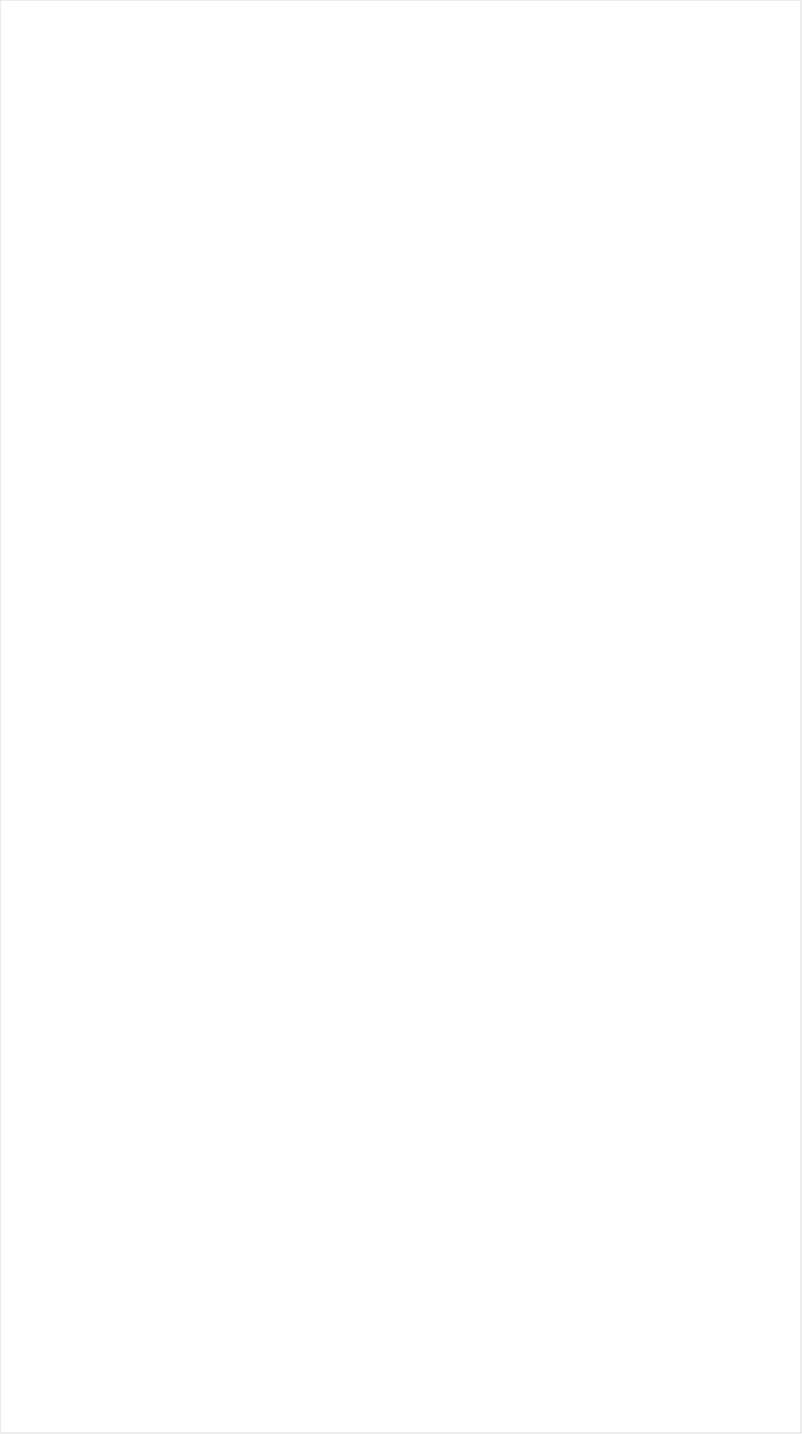
| Category | Total |
|---|---|
| Galavision | -0.933 |
| UniMas | -0.864 |
| Telemundo | -0.86 |
| TUDN | -0.842 |
| NBC Universo | -0.769 |
| Univision | -0.701 |
| VH1 | -0.674 |
| BET | -0.674 |
| BET Her | -0.644 |
| Cartoon Network | -0.642 |
| TV ONE | -0.63 |
| MTV2 | -0.614 |
| Nick Toons | -0.538 |
| Disney XD | -0.538 |
| Teen Nick | -0.532 |
| Logo | -0.501 |
| Adult Swim | -0.496 |
| Nick | -0.494 |
| Lifetime Movies | -0.491 |
| Disney Channel | -0.478 |
| Nick Jr. | -0.45 |
| Universal Kids | -0.42 |
| Oprah Winfrey Network | -0.417 |
| Discovery Life Channel | -0.394 |
| WE TV | -0.38 |
| Travel | -0.365 |
| Disney Junior US | -0.361 |
| TLC | -0.346 |
| Investigation Discovery | -0.321 |
| Lifetime | -0.306 |
| USA Network | -0.302 |
| Nick@Nite | -0.269 |
| UP TV | -0.255 |
| Freeform | -0.246 |
| MTV | -0.243 |
| Discovery Family Channel | -0.23 |
| OXYGEN | -0.217 |
| FX | -0.208 |
| SYFY | -0.173 |
| A&E | -0.162 |
| Hallmark | -0.159 |
| TNT | -0.147 |
| CMTV | -0.133 |
| E! | -0.119 |
| Headline News | -0.115 |
| FXX | -0.109 |
| Hallmark Movies & Mysteries | -0.106 |
| ION | -0.099 |
| truTV | -0.083 |
| POP | -0.077 |
| BRAVO | -0.053 |
| INSP | -0.051 |
| Great American Country | -0.048 |
| Viceland | -0.047 |
| Reelz Channel | -0.04 |
| Paramount Network | -0.01 |
| Science Channel | -0.009 |
| FX Movie Channel | -0.006 |
| National Geographic Wild | 0.015 |
| Ovation | 0.033 |
| TV LAND | 0.038 |
| Game Show | 0.049 |
| CW | 0.066 |
| Motor Trend Network | 0.067 |
| Discovery Channel | 0.073 |
| Animal Planet | 0.073 |
| TBS | 0.087 |
| Comedy Central | 0.09 |
| CNN | 0.098 |
| FOX | 0.098 |
| NBA TV | 0.108 |
| MSNBC | 0.114 |
| FYI | 0.121 |
| HGTV | 0.123 |
| History Channel | 0.138 |
| AMC | 0.141 |
| American Heroes Channel | 0.152 |
| Food Network | 0.168 |
| Weather Channel | 0.194 |
| WGN America | 0.201 |
| Cooking Channel | 0.204 |
| ABC | 0.205 |
| RFD TV | 0.216 |
| SundanceTV | 0.233 |
| Independent Film (IFC) | 0.235 |
| MyNetworkTV | 0.261 |
| Destination America | 0.264 |
| National Geographic | 0.281 |
| BBC America | 0.288 |
| Smithsonian | 0.327 |
| FXDEP | 0.328 |
| DIY | 0.338 |
| ESPN Deportes | 0.385 |
| CNBC | 0.407 |
| CBS | 0.433 |
| NBC | 0.444 |
| Fox News | 0.459 |
| The Sportsman Channel | 0.467 |
| PBS | 0.475 |
| Fox Business | 0.541 |
| NFL Network | 0.591 |
| Bloomberg HD | 0.632 |
| ESPN | 0.674 |
| Outdoor Channel | 0.681 |
| Fox Sports 1 | 0.693 |
| FOX Sports 2 | 0.705 |
| ESPN2 | 0.769 |
| ESPNEWS | 0.772 |
| MLB Network | 0.995 |
| Olympic Channel | 1.161 |
| Tennis Channel | 1.207 |
| ESPNU | 1.301 |
| Big Ten Network | 1.396 |
| PAC-12 Network | 1.452 |
| NHL | 1.501 |
| CBS Sports | 1.665 |
| NBC Sports | 1.76 |
| Golf | 6.144 |